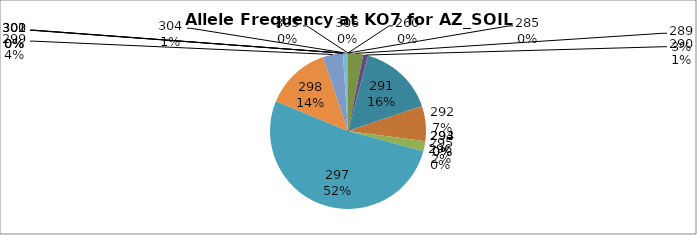
| Category | Series 0 |
|---|---|
| 260.0 | 0 |
| 285.0 | 0 |
| 289.0 | 0.031 |
| 290.0 | 0.01 |
| 291.0 | 0.156 |
| 292.0 | 0.073 |
| 293.0 | 0 |
| 294.0 | 0 |
| 295.0 | 0.021 |
| 296.0 | 0 |
| 297.0 | 0.521 |
| 298.0 | 0.135 |
| 299.0 | 0.042 |
| 300.0 | 0 |
| 301.0 | 0 |
| 302.0 | 0 |
| 304.0 | 0.01 |
| 305.0 | 0 |
| 306.0 | 0 |